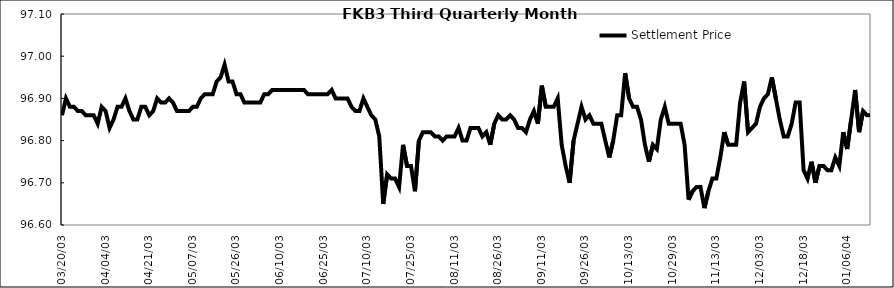
| Category | Settlement Price |
|---|---|
| 2003-03-20 | 96.86 |
| 2003-03-21 | 96.9 |
| 2003-03-24 | 96.88 |
| 2003-03-25 | 96.88 |
| 2003-03-26 | 96.87 |
| 2003-03-27 | 96.87 |
| 2003-03-28 | 96.86 |
| 2003-03-31 | 96.86 |
| 2003-04-01 | 96.86 |
| 2003-04-02 | 96.84 |
| 2003-04-03 | 96.88 |
| 2003-04-04 | 96.87 |
| 2003-04-07 | 96.83 |
| 2003-04-08 | 96.85 |
| 2003-04-09 | 96.88 |
| 2003-04-10 | 96.88 |
| 2003-04-11 | 96.9 |
| 2003-04-14 | 96.87 |
| 2003-04-15 | 96.85 |
| 2003-04-16 | 96.85 |
| 2003-04-17 | 96.88 |
| 2003-04-18 | 96.88 |
| 2003-04-21 | 96.86 |
| 2003-04-22 | 96.87 |
| 2003-04-23 | 96.9 |
| 2003-04-24 | 96.89 |
| 2003-04-25 | 96.89 |
| 2003-04-28 | 96.9 |
| 2003-04-29 | 96.89 |
| 2003-04-30 | 96.87 |
| 2003-05-02 | 96.87 |
| 2003-05-05 | 96.87 |
| 2003-05-06 | 96.87 |
| 2003-05-07 | 96.88 |
| 2003-05-08 | 96.88 |
| 2003-05-09 | 96.9 |
| 2003-05-12 | 96.91 |
| 2003-05-13 | 96.91 |
| 2003-05-16 | 96.91 |
| 2003-05-19 | 96.94 |
| 2003-05-20 | 96.95 |
| 2003-05-21 | 96.98 |
| 2003-05-22 | 96.94 |
| 2003-05-23 | 96.94 |
| 2003-05-26 | 96.91 |
| 2003-05-27 | 96.91 |
| 2003-05-28 | 96.89 |
| 2003-05-29 | 96.89 |
| 2003-05-30 | 96.89 |
| 2003-06-02 | 96.89 |
| 2003-06-03 | 96.89 |
| 2003-06-04 | 96.91 |
| 2003-06-05 | 96.91 |
| 2003-06-06 | 96.92 |
| 2003-06-09 | 96.92 |
| 2003-06-10 | 96.92 |
| 2003-06-11 | 96.92 |
| 2003-06-12 | 96.92 |
| 2003-06-13 | 96.92 |
| 2003-06-16 | 96.92 |
| 2003-06-17 | 96.92 |
| 2003-06-18 | 96.92 |
| 2003-06-19 | 96.91 |
| 2003-06-20 | 96.91 |
| 2003-06-23 | 96.91 |
| 2003-06-24 | 96.91 |
| 2003-06-25 | 96.91 |
| 2003-06-26 | 96.91 |
| 2003-06-27 | 96.92 |
| 2003-06-30 | 96.9 |
| 2003-07-01 | 96.9 |
| 2003-07-02 | 96.9 |
| 2003-07-03 | 96.9 |
| 2003-07-04 | 96.88 |
| 2003-07-07 | 96.87 |
| 2003-07-08 | 96.87 |
| 2003-07-09 | 96.9 |
| 2003-07-10 | 96.88 |
| 2003-07-11 | 96.86 |
| 2003-07-14 | 96.85 |
| 2003-07-15 | 96.81 |
| 2003-07-16 | 96.65 |
| 2003-07-17 | 96.72 |
| 2003-07-18 | 96.71 |
| 2003-07-21 | 96.71 |
| 2003-07-22 | 96.69 |
| 2003-07-23 | 96.79 |
| 2003-07-24 | 96.74 |
| 2003-07-25 | 96.74 |
| 2003-07-28 | 96.68 |
| 2003-07-29 | 96.8 |
| 2003-07-30 | 96.82 |
| 2003-07-31 | 96.82 |
| 2003-08-01 | 96.82 |
| 2003-08-04 | 96.81 |
| 2003-08-05 | 96.81 |
| 2003-08-06 | 96.8 |
| 2003-08-07 | 96.81 |
| 2003-08-08 | 96.81 |
| 2003-08-11 | 96.81 |
| 2003-08-12 | 96.83 |
| 2003-08-13 | 96.8 |
| 2003-08-14 | 96.8 |
| 2003-08-15 | 96.83 |
| 2003-08-18 | 96.83 |
| 2003-08-19 | 96.83 |
| 2003-08-20 | 96.81 |
| 2003-08-21 | 96.82 |
| 2003-08-22 | 96.79 |
| 2003-08-25 | 96.84 |
| 2003-08-26 | 96.86 |
| 2003-08-27 | 96.85 |
| 2003-08-28 | 96.85 |
| 2003-08-29 | 96.86 |
| 2003-09-02 | 96.85 |
| 2003-09-03 | 96.83 |
| 2003-09-04 | 96.83 |
| 2003-09-05 | 96.82 |
| 2003-09-08 | 96.85 |
| 2003-09-09 | 96.87 |
| 2003-09-10 | 96.84 |
| 2003-09-11 | 96.93 |
| 2003-09-12 | 96.88 |
| 2003-09-15 | 96.88 |
| 2003-09-16 | 96.88 |
| 2003-09-17 | 96.9 |
| 2003-09-18 | 96.79 |
| 2003-09-19 | 96.74 |
| 2003-09-22 | 96.7 |
| 2003-09-23 | 96.8 |
| 2003-09-24 | 96.84 |
| 2003-09-25 | 96.88 |
| 2003-09-26 | 96.85 |
| 2003-09-29 | 96.86 |
| 2003-09-30 | 96.84 |
| 2003-10-01 | 96.84 |
| 2003-10-02 | 96.84 |
| 2003-10-03 | 96.8 |
| 2003-10-06 | 96.76 |
| 2003-10-07 | 96.8 |
| 2003-10-08 | 96.86 |
| 2003-10-09 | 96.86 |
| 2003-10-10 | 96.96 |
| 2003-10-13 | 96.9 |
| 2003-10-14 | 96.88 |
| 2003-10-15 | 96.88 |
| 2003-10-16 | 96.85 |
| 2003-10-17 | 96.79 |
| 2003-10-20 | 96.75 |
| 2003-10-21 | 96.79 |
| 2003-10-22 | 96.78 |
| 2003-10-23 | 96.85 |
| 2003-10-27 | 96.88 |
| 2003-10-28 | 96.84 |
| 2003-10-29 | 96.84 |
| 2003-10-30 | 96.84 |
| 2003-10-31 | 96.84 |
| 2003-11-03 | 96.79 |
| 2003-11-04 | 96.66 |
| 2003-11-05 | 96.68 |
| 2003-11-06 | 96.69 |
| 2003-11-07 | 96.69 |
| 2003-11-10 | 96.64 |
| 2003-11-11 | 96.68 |
| 2003-11-12 | 96.71 |
| 2003-11-13 | 96.71 |
| 2003-11-14 | 96.76 |
| 2003-11-17 | 96.82 |
| 2003-11-18 | 96.79 |
| 2003-11-19 | 96.79 |
| 2003-11-20 | 96.79 |
| 2003-11-21 | 96.89 |
| 2003-11-27 | 96.94 |
| 2003-11-28 | 96.82 |
| 2003-12-01 | 96.83 |
| 2003-12-02 | 96.84 |
| 2003-12-03 | 96.88 |
| 2003-12-04 | 96.9 |
| 2003-12-05 | 96.91 |
| 2003-12-08 | 96.95 |
| 2003-12-09 | 96.9 |
| 2003-12-10 | 96.85 |
| 2003-12-11 | 96.81 |
| 2003-12-12 | 96.81 |
| 2003-12-15 | 96.84 |
| 2003-12-16 | 96.89 |
| 2003-12-17 | 96.89 |
| 2003-12-18 | 96.73 |
| 2003-12-19 | 96.71 |
| 2003-12-22 | 96.75 |
| 2003-12-23 | 96.7 |
| 2003-12-24 | 96.74 |
| 2003-12-26 | 96.74 |
| 2003-12-29 | 96.73 |
| 2003-12-30 | 96.73 |
| 2003-12-31 | 96.76 |
| 2004-01-02 | 96.74 |
| 2004-01-05 | 96.82 |
| 2004-01-06 | 96.78 |
| 2004-01-07 | 96.85 |
| 2004-01-08 | 96.92 |
| 2004-01-09 | 96.82 |
| 2004-01-12 | 96.87 |
| 2004-01-13 | 96.86 |
| 2004-01-14 | 96.86 |